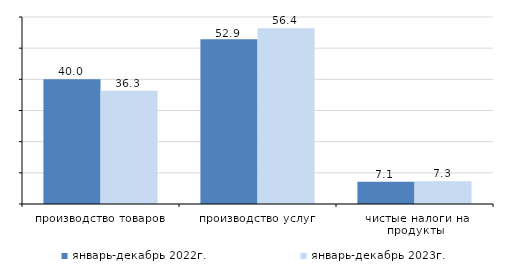
| Category | январь-декабрь 2022г.   | январь-декабрь 2023г.   |
|---|---|---|
| производство товаров | 40 | 36.3 |
| производство услуг | 52.9 | 56.4 |
| чистые налоги на продукты | 7.1 | 7.3 |